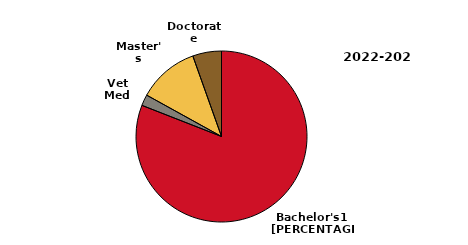
| Category | 2022-2023 |
|---|---|
| Bachelor's1 | 6020 |
| Vet Med | 156 |
| Master's | 857 |
| Doctorate | 405 |